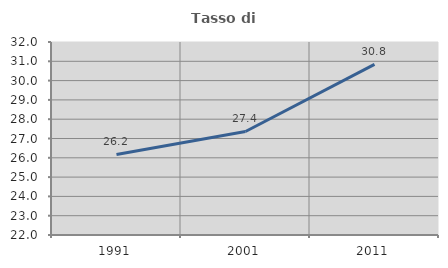
| Category | Tasso di occupazione   |
|---|---|
| 1991.0 | 26.173 |
| 2001.0 | 27.363 |
| 2011.0 | 30.837 |